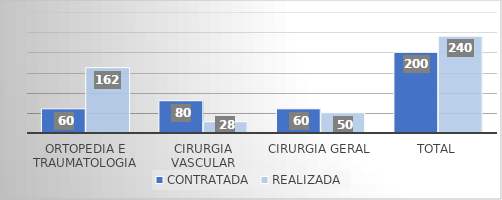
| Category | CONTRATADA | REALIZADA |
|---|---|---|
| Ortopedia e traumatologia | 60 | 162 |
| Cirurgia vascular | 80 | 28 |
| Cirurgia Geral | 60 | 50 |
| TOTAL | 200 | 240 |